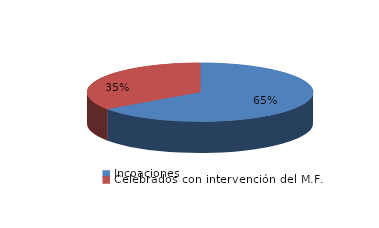
| Category | Series 0 |
|---|---|
| Incoaciones | 2875 |
| Celebrados con intervención del M.F. | 1535 |